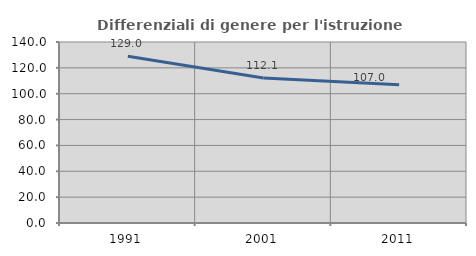
| Category | Differenziali di genere per l'istruzione superiore |
|---|---|
| 1991.0 | 128.979 |
| 2001.0 | 112.09 |
| 2011.0 | 107.012 |